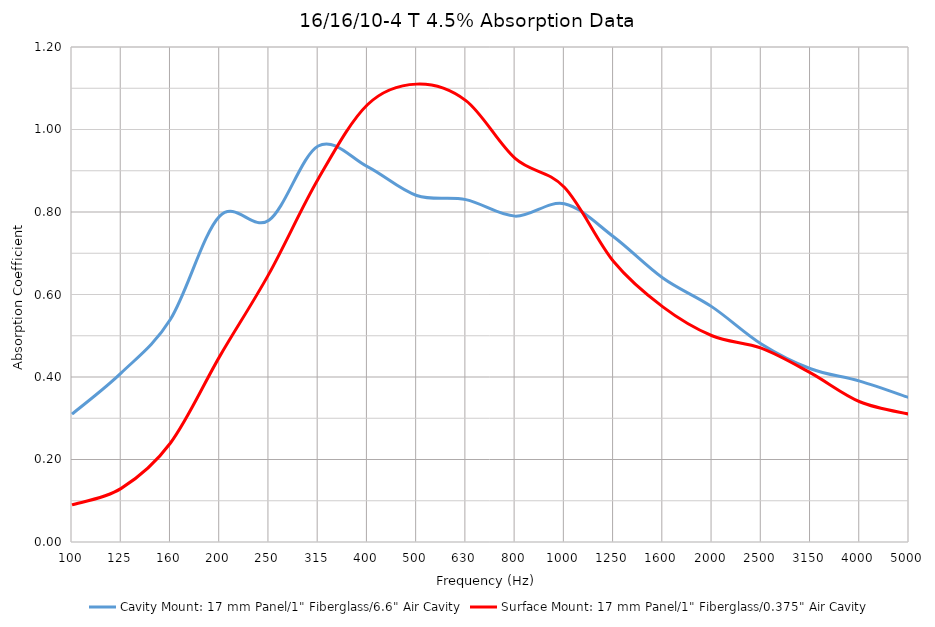
| Category | Cavity Mount: 17 mm Panel/1" Fiberglass/6.6" Air Cavity | Surface Mount: 17 mm Panel/1" Fiberglass/0.375" Air Cavity |
|---|---|---|
| 100.0 | 0.31 | 0.09 |
| 125.0 | 0.41 | 0.13 |
| 160.0 | 0.54 | 0.24 |
| 200.0 | 0.79 | 0.45 |
| 250.0 | 0.78 | 0.65 |
| 315.0 | 0.96 | 0.88 |
| 400.0 | 0.91 | 1.06 |
| 500.0 | 0.84 | 1.11 |
| 630.0 | 0.83 | 1.07 |
| 800.0 | 0.79 | 0.93 |
| 1000.0 | 0.82 | 0.86 |
| 1250.0 | 0.74 | 0.68 |
| 1600.0 | 0.64 | 0.57 |
| 2000.0 | 0.57 | 0.5 |
| 2500.0 | 0.48 | 0.47 |
| 3150.0 | 0.42 | 0.41 |
| 4000.0 | 0.39 | 0.34 |
| 5000.0 | 0.35 | 0.31 |